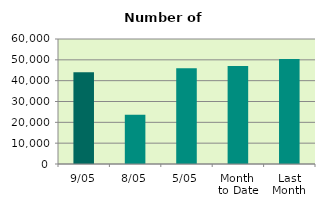
| Category | Series 0 |
|---|---|
| 9/05 | 44068 |
| 8/05 | 23586 |
| 5/05 | 45976 |
| Month 
to Date | 47074 |
| Last
Month | 50445.556 |